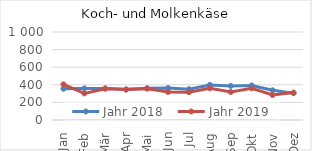
| Category | Jahr 2018 | Jahr 2019 |
|---|---|---|
| Jan | 355.444 | 404.56 |
| Feb | 358.96 | 302.475 |
| Mär | 359.31 | 355.718 |
| Apr | 348.07 | 345.577 |
| Mai | 360.338 | 356.04 |
| Jun | 363.072 | 318.508 |
| Jul | 350.265 | 316.347 |
| Aug | 398.119 | 360.194 |
| Sep | 387.542 | 318.235 |
| Okt | 392.908 | 359.404 |
| Nov | 337.415 | 283.548 |
| Dez | 304.077 | 311.966 |